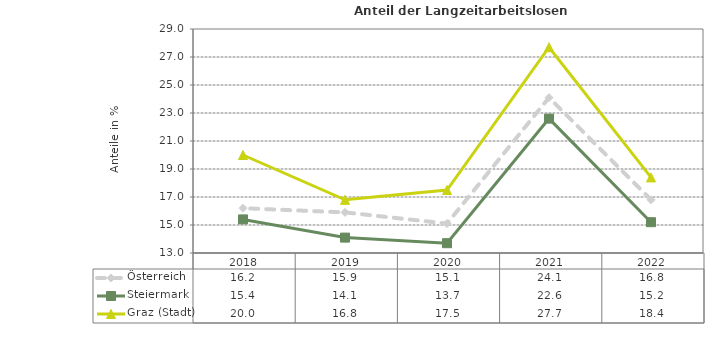
| Category | Österreich | Steiermark | Graz (Stadt) |
|---|---|---|---|
| 2022.0 | 16.8 | 15.2 | 18.4 |
| 2021.0 | 24.1 | 22.6 | 27.7 |
| 2020.0 | 15.1 | 13.7 | 17.5 |
| 2019.0 | 15.9 | 14.1 | 16.8 |
| 2018.0 | 16.2 | 15.4 | 20 |